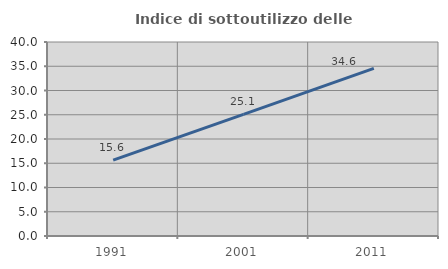
| Category | Indice di sottoutilizzo delle abitazioni  |
|---|---|
| 1991.0 | 15.641 |
| 2001.0 | 25.089 |
| 2011.0 | 34.558 |